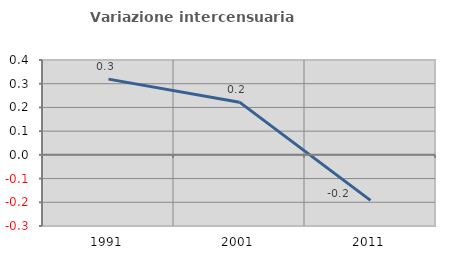
| Category | Variazione intercensuaria annua |
|---|---|
| 1991.0 | 0.319 |
| 2001.0 | 0.222 |
| 2011.0 | -0.192 |